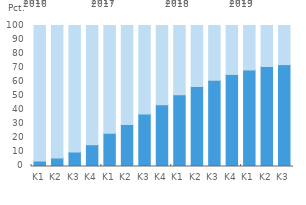
| Category | Kontaktløs | Chip |
|---|---|---|
| K1 | 3.926 | 96.074 |
| K2 | 6.081 | 93.919 |
| K3 | 10.274 | 89.726 |
| K4 | 15.422 | 84.578 |
| K1 | 23.581 | 76.419 |
| K2 | 29.742 | 70.258 |
| K3 | 37.161 | 62.839 |
| K4 | 43.882 | 56.118 |
| K1 | 50.95 | 49.05 |
| K2 | 56.727 | 43.273 |
| K3 | 61.161 | 38.839 |
| K4 | 65.303 | 34.697 |
| K1 | 68.453 | 31.547 |
| K2 | 70.929 | 29.071 |
| K3 | 72.268 | 27.732 |